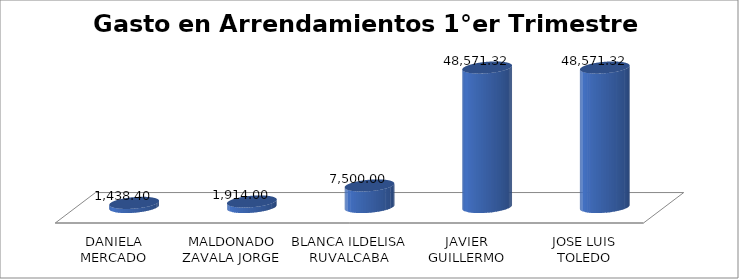
| Category | Suma |
|---|---|
| DANIELA MERCADO STONE | 1438.4 |
| MALDONADO ZAVALA JORGE | 1914 |
| BLANCA ILDELISA RUVALCABA MEJIA | 7500 |
| JAVIER GUILLERMO TOLEDO GONZALEZ | 48571.32 |
| JOSE LUIS TOLEDO GONZALEZ | 48571.32 |